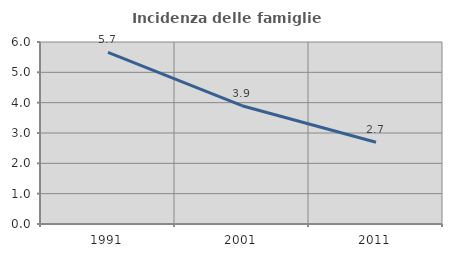
| Category | Incidenza delle famiglie numerose |
|---|---|
| 1991.0 | 5.656 |
| 2001.0 | 3.901 |
| 2011.0 | 2.694 |